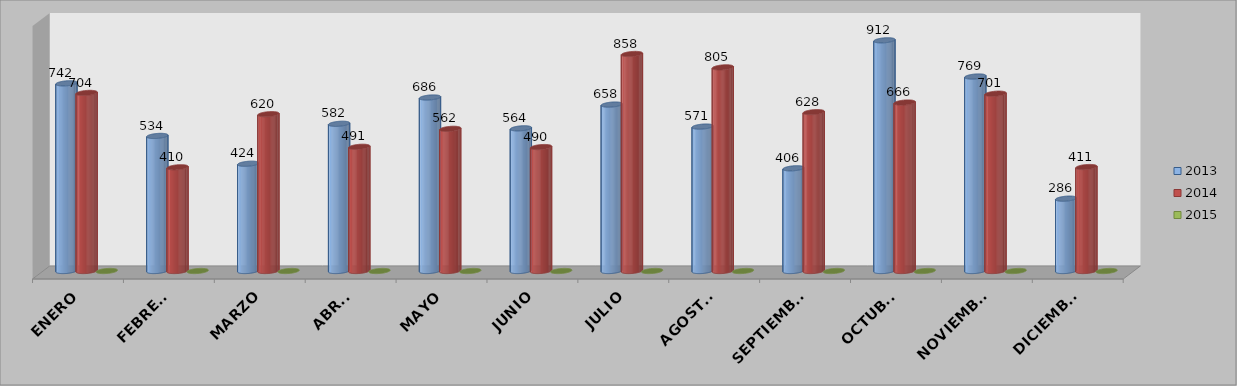
| Category | 2013 | 2014 | 2015 |
|---|---|---|---|
| ENERO | 742 | 704 | 0 |
| FEBRERO | 534 | 410 | 0 |
| MARZO | 424 | 620 | 0 |
| ABRIL | 582 | 491 | 0 |
| MAYO | 686 | 562 | 0 |
| JUNIO | 564 | 490 | 0 |
| JULIO | 658 | 858 | 0 |
| AGOSTO | 571 | 805 | 0 |
| SEPTIEMBRE | 406 | 628 | 0 |
| OCTUBRE | 912 | 666 | 0 |
| NOVIEMBRE | 769 | 701 | 0 |
| DICIEMBRE | 286 | 411 | 0 |